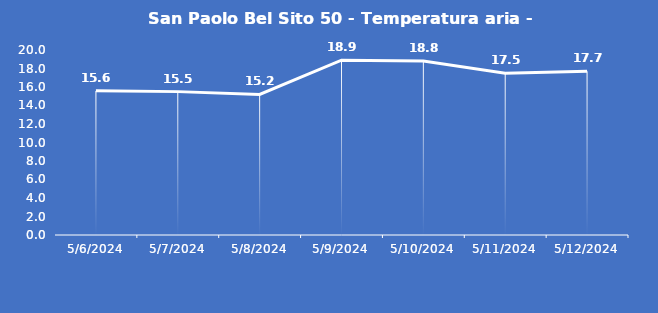
| Category | San Paolo Bel Sito 50 - Temperatura aria - Grezzo (°C) |
|---|---|
| 5/6/24 | 15.6 |
| 5/7/24 | 15.5 |
| 5/8/24 | 15.2 |
| 5/9/24 | 18.9 |
| 5/10/24 | 18.8 |
| 5/11/24 | 17.5 |
| 5/12/24 | 17.7 |